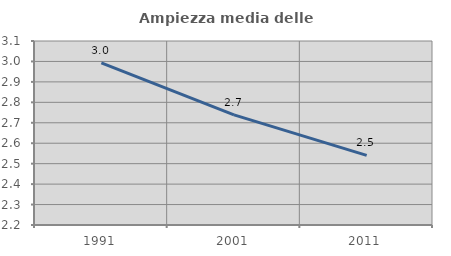
| Category | Ampiezza media delle famiglie |
|---|---|
| 1991.0 | 2.993 |
| 2001.0 | 2.739 |
| 2011.0 | 2.541 |